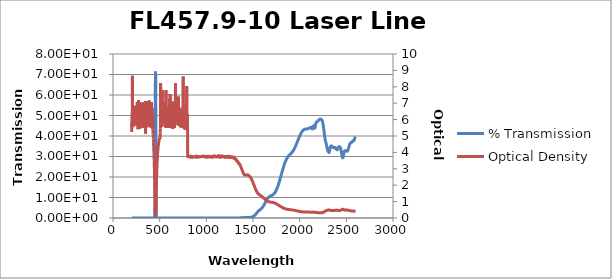
| Category | % Transmission |
|---|---|
| 200.0 | 0.001 |
| 201.0 | 0.001 |
| 202.0 | 0 |
| 203.0 | 0 |
| 204.0 | 0 |
| 205.0 | 0 |
| 206.0 | 0 |
| 207.0 | 0 |
| 208.0 | 0 |
| 209.0 | 0 |
| 210.0 | 0 |
| 211.0 | 0 |
| 212.0 | 0 |
| 213.0 | 0 |
| 214.0 | 0 |
| 215.0 | 0 |
| 216.0 | 0 |
| 217.0 | 0 |
| 218.0 | 0 |
| 219.0 | 0 |
| 220.0 | 0 |
| 221.0 | 0 |
| 222.0 | 0 |
| 223.0 | 0 |
| 224.0 | 0 |
| 225.0 | 0 |
| 226.0 | 0 |
| 227.0 | 0 |
| 228.0 | 0 |
| 229.0 | 0 |
| 230.0 | 0 |
| 231.0 | 0 |
| 232.0 | 0 |
| 233.0 | 0 |
| 234.0 | 0 |
| 235.0 | 0 |
| 236.0 | 0 |
| 237.0 | 0 |
| 238.0 | 0 |
| 239.0 | 0 |
| 240.0 | 0 |
| 241.0 | 0 |
| 242.0 | 0 |
| 243.0 | 0 |
| 244.0 | 0 |
| 245.0 | 0 |
| 246.0 | 0 |
| 247.0 | 0 |
| 248.0 | 0 |
| 249.0 | 0 |
| 250.0 | 0 |
| 251.0 | 0 |
| 252.0 | 0 |
| 253.0 | 0 |
| 254.0 | 0 |
| 255.0 | 0 |
| 256.0 | 0 |
| 257.0 | 0 |
| 258.0 | 0 |
| 259.0 | 0 |
| 260.0 | 0 |
| 261.0 | 0 |
| 262.0 | 0 |
| 263.0 | 0 |
| 264.0 | 0 |
| 265.0 | 0 |
| 266.0 | 0 |
| 267.0 | 0 |
| 268.0 | 0 |
| 269.0 | 0 |
| 270.0 | 0 |
| 271.0 | 0 |
| 272.0 | 0 |
| 273.0 | 0 |
| 274.0 | 0 |
| 275.0 | 0 |
| 276.0 | 0 |
| 277.0 | 0 |
| 278.0 | 0 |
| 279.0 | 0 |
| 280.0 | 0 |
| 281.0 | 0 |
| 282.0 | 0 |
| 283.0 | 0 |
| 284.0 | 0 |
| 285.0 | 0 |
| 286.0 | 0 |
| 287.0 | 0 |
| 288.0 | 0 |
| 289.0 | 0 |
| 290.0 | 0 |
| 291.0 | 0 |
| 292.0 | 0 |
| 293.0 | 0 |
| 294.0 | 0 |
| 295.0 | 0 |
| 296.0 | 0 |
| 297.0 | 0 |
| 298.0 | 0 |
| 299.0 | 0 |
| 300.0 | 0 |
| 301.0 | 0 |
| 302.0 | 0 |
| 303.0 | 0 |
| 304.0 | 0 |
| 305.0 | 0 |
| 306.0 | 0 |
| 307.0 | 0 |
| 308.0 | 0 |
| 309.0 | 0 |
| 310.0 | 0 |
| 311.0 | 0 |
| 312.0 | 0 |
| 313.0 | 0 |
| 314.0 | 0 |
| 315.0 | 0 |
| 316.0 | 0 |
| 317.0 | 0 |
| 318.0 | 0 |
| 319.0 | 0 |
| 320.0 | 0 |
| 321.0 | 0 |
| 322.0 | 0 |
| 323.0 | 0 |
| 324.0 | 0 |
| 325.0 | 0 |
| 326.0 | 0 |
| 327.0 | 0 |
| 328.0 | 0 |
| 329.0 | 0 |
| 330.0 | 0 |
| 331.0 | 0 |
| 332.0 | 0 |
| 333.0 | 0 |
| 334.0 | 0 |
| 335.0 | 0 |
| 336.0 | 0 |
| 337.0 | 0 |
| 338.0 | 0 |
| 339.0 | 0 |
| 340.0 | 0 |
| 341.0 | 0 |
| 342.0 | 0 |
| 343.0 | 0 |
| 344.0 | 0 |
| 345.0 | 0 |
| 346.0 | 0 |
| 347.0 | 0 |
| 348.0 | 0 |
| 349.0 | 0.001 |
| 350.0 | 0 |
| 351.0 | 0 |
| 352.0 | 0 |
| 353.0 | 0 |
| 354.0 | 0 |
| 355.0 | 0 |
| 356.0 | 0 |
| 357.0 | 0 |
| 358.0 | 0 |
| 359.0 | 0 |
| 360.0 | 0 |
| 361.0 | 0 |
| 362.0 | 0 |
| 363.0 | 0 |
| 364.0 | 0 |
| 365.0 | 0 |
| 366.0 | 0 |
| 367.0 | 0 |
| 368.0 | 0 |
| 369.0 | 0 |
| 370.0 | 0 |
| 371.0 | 0 |
| 372.0 | 0 |
| 373.0 | 0 |
| 374.0 | 0 |
| 375.0 | 0 |
| 376.0 | 0 |
| 377.0 | 0 |
| 378.0 | 0 |
| 379.0 | 0 |
| 380.0 | 0 |
| 381.0 | 0 |
| 382.0 | 0 |
| 383.0 | 0 |
| 384.0 | 0 |
| 385.0 | 0 |
| 386.0 | 0 |
| 387.0 | 0 |
| 388.0 | 0 |
| 389.0 | 0 |
| 390.0 | 0 |
| 391.0 | 0 |
| 392.0 | 0 |
| 393.0 | 0 |
| 394.0 | 0 |
| 395.0 | 0 |
| 396.0 | 0 |
| 397.0 | 0 |
| 398.0 | 0 |
| 399.0 | 0 |
| 400.0 | 0 |
| 401.0 | 0 |
| 402.0 | 0 |
| 403.0 | 0 |
| 404.0 | 0 |
| 405.0 | 0 |
| 406.0 | 0 |
| 407.0 | 0 |
| 408.0 | 0 |
| 409.0 | 0 |
| 410.0 | 0 |
| 411.0 | 0 |
| 412.0 | 0 |
| 413.0 | 0 |
| 414.0 | 0 |
| 415.0 | 0 |
| 416.0 | 0 |
| 417.0 | 0 |
| 418.0 | 0 |
| 419.0 | 0 |
| 420.0 | 0 |
| 421.0 | 0 |
| 422.0 | 0 |
| 423.0 | 0 |
| 424.0 | 0 |
| 425.0 | 0 |
| 426.0 | 0 |
| 427.0 | 0 |
| 428.0 | 0 |
| 429.0 | 0.001 |
| 430.0 | 0.001 |
| 431.0 | 0.001 |
| 432.0 | 0.001 |
| 433.0 | 0.002 |
| 434.0 | 0.002 |
| 435.0 | 0.003 |
| 436.0 | 0.004 |
| 437.0 | 0.006 |
| 438.0 | 0.009 |
| 439.0 | 0.013 |
| 440.0 | 0.019 |
| 441.0 | 0.03 |
| 442.0 | 0.048 |
| 443.0 | 0.08 |
| 444.0 | 0.139 |
| 445.0 | 0.257 |
| 446.0 | 0.506 |
| 447.0 | 1.075 |
| 448.0 | 2.472 |
| 449.0 | 5.96 |
| 450.0 | 13.668 |
| 451.0 | 26.602 |
| 452.0 | 42.537 |
| 453.0 | 56.255 |
| 454.0 | 65.276 |
| 455.0 | 69.96 |
| 456.0 | 71.432 |
| 457.0 | 70.375 |
| 458.0 | 65.673 |
| 459.0 | 54.675 |
| 460.0 | 37.794 |
| 461.0 | 21.076 |
| 462.0 | 9.936 |
| 463.0 | 4.436 |
| 464.0 | 2.092 |
| 465.0 | 1.06 |
| 466.0 | 0.587 |
| 467.0 | 0.349 |
| 468.0 | 0.219 |
| 469.0 | 0.144 |
| 470.0 | 0.098 |
| 471.0 | 0.069 |
| 472.0 | 0.05 |
| 473.0 | 0.037 |
| 474.0 | 0.028 |
| 475.0 | 0.022 |
| 476.0 | 0.017 |
| 477.0 | 0.014 |
| 478.0 | 0.011 |
| 479.0 | 0.01 |
| 480.0 | 0.008 |
| 481.0 | 0.007 |
| 482.0 | 0.006 |
| 483.0 | 0.005 |
| 484.0 | 0.004 |
| 485.0 | 0.004 |
| 486.0 | 0.004 |
| 487.0 | 0.003 |
| 488.0 | 0.003 |
| 489.0 | 0.003 |
| 490.0 | 0.002 |
| 491.0 | 0.002 |
| 492.0 | 0.002 |
| 493.0 | 0.002 |
| 494.0 | 0.002 |
| 495.0 | 0.002 |
| 496.0 | 0.001 |
| 497.0 | 0.001 |
| 498.0 | 0.001 |
| 499.0 | 0.001 |
| 500.0 | 0.001 |
| 501.0 | 0.001 |
| 502.0 | 0.001 |
| 503.0 | 0.001 |
| 504.0 | 0.001 |
| 505.0 | 0.001 |
| 506.0 | 0.001 |
| 507.0 | 0 |
| 508.0 | 0 |
| 509.0 | 0 |
| 510.0 | 0 |
| 511.0 | 0 |
| 512.0 | 0 |
| 513.0 | 0 |
| 514.0 | 0 |
| 515.0 | 0 |
| 516.0 | 0 |
| 517.0 | 0 |
| 518.0 | 0 |
| 519.0 | 0 |
| 520.0 | 0 |
| 521.0 | 0 |
| 522.0 | 0 |
| 523.0 | 0 |
| 524.0 | 0 |
| 525.0 | 0 |
| 526.0 | 0 |
| 527.0 | 0 |
| 528.0 | 0 |
| 529.0 | 0 |
| 530.0 | 0 |
| 531.0 | 0 |
| 532.0 | 0 |
| 533.0 | 0 |
| 534.0 | 0 |
| 535.0 | 0 |
| 536.0 | 0 |
| 537.0 | 0 |
| 538.0 | 0 |
| 539.0 | 0 |
| 540.0 | 0 |
| 541.0 | 0 |
| 542.0 | 0 |
| 543.0 | 0 |
| 544.0 | 0 |
| 545.0 | 0 |
| 546.0 | 0 |
| 547.0 | 0 |
| 548.0 | 0 |
| 549.0 | 0 |
| 550.0 | 0 |
| 551.0 | 0 |
| 552.0 | 0 |
| 553.0 | 0 |
| 554.0 | 0 |
| 555.0 | 0 |
| 556.0 | 0 |
| 557.0 | 0 |
| 558.0 | 0 |
| 559.0 | 0 |
| 560.0 | 0 |
| 561.0 | 0 |
| 562.0 | 0 |
| 563.0 | 0 |
| 564.0 | 0 |
| 565.0 | 0 |
| 566.0 | 0 |
| 567.0 | 0 |
| 568.0 | 0 |
| 569.0 | 0 |
| 570.0 | 0 |
| 571.0 | 0 |
| 572.0 | 0 |
| 573.0 | 0 |
| 574.0 | 0 |
| 575.0 | 0 |
| 576.0 | 0 |
| 577.0 | 0 |
| 578.0 | 0 |
| 579.0 | 0 |
| 580.0 | 0 |
| 581.0 | 0 |
| 582.0 | 0 |
| 583.0 | 0 |
| 584.0 | 0 |
| 585.0 | 0 |
| 586.0 | 0 |
| 587.0 | 0 |
| 588.0 | 0 |
| 589.0 | 0 |
| 590.0 | 0 |
| 591.0 | 0 |
| 592.0 | 0 |
| 593.0 | 0 |
| 594.0 | 0 |
| 595.0 | 0 |
| 596.0 | 0 |
| 597.0 | 0 |
| 598.0 | 0 |
| 599.0 | 0 |
| 600.0 | 0 |
| 601.0 | 0 |
| 602.0 | 0 |
| 603.0 | 0 |
| 604.0 | 0 |
| 605.0 | 0 |
| 606.0 | 0 |
| 607.0 | 0 |
| 608.0 | 0 |
| 609.0 | 0 |
| 610.0 | 0 |
| 611.0 | 0 |
| 612.0 | 0 |
| 613.0 | 0 |
| 614.0 | 0 |
| 615.0 | 0 |
| 616.0 | 0 |
| 617.0 | 0 |
| 618.0 | 0 |
| 619.0 | 0 |
| 620.0 | 0 |
| 621.0 | 0 |
| 622.0 | 0 |
| 623.0 | 0 |
| 624.0 | 0 |
| 625.0 | 0 |
| 626.0 | 0 |
| 627.0 | 0 |
| 628.0 | 0 |
| 629.0 | 0 |
| 630.0 | 0 |
| 631.0 | 0 |
| 632.0 | 0 |
| 633.0 | 0 |
| 634.0 | 0 |
| 635.0 | 0 |
| 636.0 | 0 |
| 637.0 | 0 |
| 638.0 | 0 |
| 639.0 | 0 |
| 640.0 | 0 |
| 641.0 | 0 |
| 642.0 | 0 |
| 643.0 | 0 |
| 644.0 | 0 |
| 645.0 | 0 |
| 646.0 | 0 |
| 647.0 | 0 |
| 648.0 | 0 |
| 649.0 | 0 |
| 650.0 | 0 |
| 651.0 | 0 |
| 652.0 | 0 |
| 653.0 | 0 |
| 654.0 | 0 |
| 655.0 | 0 |
| 656.0 | 0 |
| 657.0 | 0 |
| 658.0 | 0 |
| 659.0 | 0 |
| 660.0 | 0 |
| 661.0 | 0 |
| 662.0 | 0 |
| 663.0 | 0 |
| 664.0 | 0 |
| 665.0 | 0 |
| 666.0 | 0 |
| 667.0 | 0 |
| 668.0 | 0 |
| 669.0 | 0 |
| 670.0 | 0 |
| 671.0 | 0 |
| 672.0 | 0 |
| 673.0 | 0 |
| 674.0 | 0 |
| 675.0 | 0 |
| 676.0 | 0 |
| 677.0 | 0 |
| 678.0 | 0 |
| 679.0 | 0 |
| 680.0 | 0 |
| 681.0 | 0 |
| 682.0 | 0 |
| 683.0 | 0 |
| 684.0 | 0 |
| 685.0 | 0 |
| 686.0 | 0 |
| 687.0 | 0 |
| 688.0 | 0 |
| 689.0 | 0 |
| 690.0 | 0 |
| 691.0 | 0 |
| 692.0 | 0 |
| 693.0 | 0 |
| 694.0 | 0 |
| 695.0 | 0 |
| 696.0 | 0 |
| 697.0 | 0 |
| 698.0 | 0 |
| 699.0 | 0 |
| 700.0 | 0 |
| 701.0 | 0 |
| 702.0 | 0 |
| 703.0 | 0 |
| 704.0 | 0 |
| 705.0 | 0 |
| 706.0 | 0 |
| 707.0 | 0 |
| 708.0 | 0 |
| 709.0 | 0 |
| 710.0 | 0 |
| 711.0 | 0 |
| 712.0 | 0 |
| 713.0 | 0 |
| 714.0 | 0 |
| 715.0 | 0 |
| 716.0 | 0 |
| 717.0 | 0 |
| 718.0 | 0 |
| 719.0 | 0 |
| 720.0 | 0 |
| 721.0 | 0 |
| 722.0 | 0 |
| 723.0 | 0 |
| 724.0 | 0 |
| 725.0 | 0 |
| 726.0 | 0 |
| 727.0 | 0 |
| 728.0 | 0 |
| 729.0 | 0 |
| 730.0 | 0 |
| 731.0 | 0 |
| 732.0 | 0 |
| 733.0 | 0 |
| 734.0 | 0 |
| 735.0 | 0 |
| 736.0 | 0 |
| 737.0 | 0 |
| 738.0 | 0 |
| 739.0 | 0 |
| 740.0 | 0 |
| 741.0 | 0 |
| 742.0 | 0 |
| 743.0 | 0 |
| 744.0 | 0 |
| 745.0 | 0 |
| 746.0 | 0 |
| 747.0 | 0 |
| 748.0 | 0 |
| 749.0 | 0 |
| 750.0 | 0 |
| 751.0 | 0 |
| 752.0 | 0 |
| 753.0 | 0 |
| 754.0 | 0 |
| 755.0 | 0 |
| 756.0 | 0 |
| 757.0 | 0 |
| 758.0 | 0 |
| 759.0 | 0 |
| 760.0 | 0 |
| 761.0 | 0 |
| 762.0 | 0 |
| 763.0 | 0 |
| 764.0 | 0 |
| 765.0 | 0 |
| 766.0 | 0 |
| 767.0 | 0 |
| 768.0 | 0 |
| 769.0 | 0 |
| 770.0 | 0 |
| 771.0 | 0 |
| 772.0 | 0 |
| 773.0 | 0 |
| 774.0 | 0 |
| 775.0 | 0 |
| 776.0 | 0 |
| 777.0 | 0 |
| 778.0 | 0 |
| 779.0 | 0 |
| 780.0 | 0 |
| 781.0 | 0 |
| 782.0 | 0 |
| 783.0 | 0 |
| 784.0 | 0 |
| 785.0 | 0 |
| 786.0 | 0 |
| 787.0 | 0 |
| 788.0 | 0 |
| 789.0 | 0 |
| 790.0 | 0 |
| 791.0 | 0 |
| 792.0 | 0 |
| 793.0 | 0 |
| 794.0 | 0 |
| 795.0 | 0 |
| 796.0 | 0 |
| 797.0 | 0 |
| 798.0 | 0 |
| 799.0 | 0 |
| 800.0 | 0.017 |
| 801.0 | 0.019 |
| 802.0 | 0.017 |
| 803.0 | 0.016 |
| 804.0 | 0.02 |
| 805.0 | 0.016 |
| 806.0 | 0.018 |
| 807.0 | 0.018 |
| 808.0 | 0.018 |
| 809.0 | 0.017 |
| 810.0 | 0.02 |
| 811.0 | 0.019 |
| 812.0 | 0.018 |
| 813.0 | 0.017 |
| 814.0 | 0.017 |
| 815.0 | 0.017 |
| 816.0 | 0.017 |
| 817.0 | 0.02 |
| 818.0 | 0.018 |
| 819.0 | 0.017 |
| 820.0 | 0.016 |
| 821.0 | 0.018 |
| 822.0 | 0.019 |
| 823.0 | 0.018 |
| 824.0 | 0.019 |
| 825.0 | 0.019 |
| 826.0 | 0.019 |
| 827.0 | 0.018 |
| 828.0 | 0.019 |
| 829.0 | 0.017 |
| 830.0 | 0.017 |
| 831.0 | 0.017 |
| 832.0 | 0.017 |
| 833.0 | 0.017 |
| 834.0 | 0.017 |
| 835.0 | 0.017 |
| 836.0 | 0.018 |
| 837.0 | 0.018 |
| 838.0 | 0.018 |
| 839.0 | 0.018 |
| 840.0 | 0.023 |
| 841.0 | 0.017 |
| 842.0 | 0.021 |
| 843.0 | 0.018 |
| 844.0 | 0.018 |
| 845.0 | 0.019 |
| 846.0 | 0.017 |
| 847.0 | 0.016 |
| 848.0 | 0.021 |
| 849.0 | 0.018 |
| 850.0 | 0.019 |
| 851.0 | 0.019 |
| 852.0 | 0.02 |
| 853.0 | 0.019 |
| 854.0 | 0.018 |
| 855.0 | 0.018 |
| 856.0 | 0.019 |
| 857.0 | 0.019 |
| 858.0 | 0.021 |
| 859.0 | 0.021 |
| 860.0 | 0.018 |
| 861.0 | 0.018 |
| 862.0 | 0.016 |
| 863.0 | 0.018 |
| 864.0 | 0.019 |
| 865.0 | 0.019 |
| 866.0 | 0.019 |
| 867.0 | 0.019 |
| 868.0 | 0.019 |
| 869.0 | 0.019 |
| 870.0 | 0.016 |
| 871.0 | 0.02 |
| 872.0 | 0.017 |
| 873.0 | 0.02 |
| 874.0 | 0.02 |
| 875.0 | 0.017 |
| 876.0 | 0.018 |
| 877.0 | 0.017 |
| 878.0 | 0.019 |
| 879.0 | 0.018 |
| 880.0 | 0.019 |
| 881.0 | 0.019 |
| 882.0 | 0.018 |
| 883.0 | 0.019 |
| 884.0 | 0.017 |
| 885.0 | 0.017 |
| 886.0 | 0.018 |
| 887.0 | 0.019 |
| 888.0 | 0.019 |
| 889.0 | 0.016 |
| 890.0 | 0.017 |
| 891.0 | 0.018 |
| 892.0 | 0.016 |
| 893.0 | 0.017 |
| 894.0 | 0.02 |
| 895.0 | 0.017 |
| 896.0 | 0.017 |
| 897.0 | 0.017 |
| 898.0 | 0.017 |
| 899.0 | 0.018 |
| 900.0 | 0.019 |
| 901.0 | 0.018 |
| 902.0 | 0.018 |
| 903.0 | 0.019 |
| 904.0 | 0.02 |
| 905.0 | 0.02 |
| 906.0 | 0.02 |
| 907.0 | 0.019 |
| 908.0 | 0.016 |
| 909.0 | 0.015 |
| 910.0 | 0.018 |
| 911.0 | 0.016 |
| 912.0 | 0.021 |
| 913.0 | 0.02 |
| 914.0 | 0.017 |
| 915.0 | 0.017 |
| 916.0 | 0.018 |
| 917.0 | 0.018 |
| 918.0 | 0.018 |
| 919.0 | 0.016 |
| 920.0 | 0.017 |
| 921.0 | 0.02 |
| 922.0 | 0.021 |
| 923.0 | 0.018 |
| 924.0 | 0.02 |
| 925.0 | 0.019 |
| 926.0 | 0.019 |
| 927.0 | 0.019 |
| 928.0 | 0.02 |
| 929.0 | 0.017 |
| 930.0 | 0.018 |
| 931.0 | 0.017 |
| 932.0 | 0.019 |
| 933.0 | 0.017 |
| 934.0 | 0.021 |
| 935.0 | 0.018 |
| 936.0 | 0.019 |
| 937.0 | 0.017 |
| 938.0 | 0.019 |
| 939.0 | 0.018 |
| 940.0 | 0.019 |
| 941.0 | 0.02 |
| 942.0 | 0.016 |
| 943.0 | 0.017 |
| 944.0 | 0.018 |
| 945.0 | 0.018 |
| 946.0 | 0.02 |
| 947.0 | 0.019 |
| 948.0 | 0.018 |
| 949.0 | 0.019 |
| 950.0 | 0.017 |
| 951.0 | 0.018 |
| 952.0 | 0.019 |
| 953.0 | 0.021 |
| 954.0 | 0.019 |
| 955.0 | 0.019 |
| 956.0 | 0.018 |
| 957.0 | 0.017 |
| 958.0 | 0.018 |
| 959.0 | 0.016 |
| 960.0 | 0.017 |
| 961.0 | 0.017 |
| 962.0 | 0.017 |
| 963.0 | 0.019 |
| 964.0 | 0.02 |
| 965.0 | 0.016 |
| 966.0 | 0.017 |
| 967.0 | 0.018 |
| 968.0 | 0.017 |
| 969.0 | 0.018 |
| 970.0 | 0.018 |
| 971.0 | 0.019 |
| 972.0 | 0.017 |
| 973.0 | 0.021 |
| 974.0 | 0.018 |
| 975.0 | 0.017 |
| 976.0 | 0.018 |
| 977.0 | 0.017 |
| 978.0 | 0.02 |
| 979.0 | 0.017 |
| 980.0 | 0.019 |
| 981.0 | 0.019 |
| 982.0 | 0.018 |
| 983.0 | 0.018 |
| 984.0 | 0.018 |
| 985.0 | 0.018 |
| 986.0 | 0.019 |
| 987.0 | 0.019 |
| 988.0 | 0.016 |
| 989.0 | 0.02 |
| 990.0 | 0.018 |
| 991.0 | 0.019 |
| 992.0 | 0.016 |
| 993.0 | 0.017 |
| 994.0 | 0.018 |
| 995.0 | 0.018 |
| 996.0 | 0.02 |
| 997.0 | 0.019 |
| 998.0 | 0.017 |
| 999.0 | 0.018 |
| 1000.0 | 0.017 |
| 1001.0 | 0.017 |
| 1002.0 | 0.018 |
| 1003.0 | 0.018 |
| 1004.0 | 0.019 |
| 1005.0 | 0.021 |
| 1006.0 | 0.017 |
| 1007.0 | 0.016 |
| 1008.0 | 0.021 |
| 1009.0 | 0.018 |
| 1010.0 | 0.016 |
| 1011.0 | 0.015 |
| 1012.0 | 0.019 |
| 1013.0 | 0.017 |
| 1014.0 | 0.019 |
| 1015.0 | 0.02 |
| 1016.0 | 0.019 |
| 1017.0 | 0.018 |
| 1018.0 | 0.018 |
| 1019.0 | 0.017 |
| 1020.0 | 0.016 |
| 1021.0 | 0.019 |
| 1022.0 | 0.016 |
| 1023.0 | 0.014 |
| 1024.0 | 0.018 |
| 1025.0 | 0.019 |
| 1026.0 | 0.018 |
| 1027.0 | 0.017 |
| 1028.0 | 0.018 |
| 1029.0 | 0.017 |
| 1030.0 | 0.017 |
| 1031.0 | 0.018 |
| 1032.0 | 0.017 |
| 1033.0 | 0.016 |
| 1034.0 | 0.018 |
| 1035.0 | 0.018 |
| 1036.0 | 0.016 |
| 1037.0 | 0.02 |
| 1038.0 | 0.016 |
| 1039.0 | 0.016 |
| 1040.0 | 0.019 |
| 1041.0 | 0.018 |
| 1042.0 | 0.017 |
| 1043.0 | 0.018 |
| 1044.0 | 0.018 |
| 1045.0 | 0.019 |
| 1046.0 | 0.02 |
| 1047.0 | 0.02 |
| 1048.0 | 0.017 |
| 1049.0 | 0.018 |
| 1050.0 | 0.018 |
| 1051.0 | 0.02 |
| 1052.0 | 0.02 |
| 1053.0 | 0.018 |
| 1054.0 | 0.02 |
| 1055.0 | 0.017 |
| 1056.0 | 0.02 |
| 1057.0 | 0.018 |
| 1058.0 | 0.017 |
| 1059.0 | 0.019 |
| 1060.0 | 0.017 |
| 1061.0 | 0.019 |
| 1062.0 | 0.02 |
| 1063.0 | 0.02 |
| 1064.0 | 0.016 |
| 1065.0 | 0.02 |
| 1066.0 | 0.019 |
| 1067.0 | 0.018 |
| 1068.0 | 0.016 |
| 1069.0 | 0.021 |
| 1070.0 | 0.02 |
| 1071.0 | 0.018 |
| 1072.0 | 0.017 |
| 1073.0 | 0.017 |
| 1074.0 | 0.018 |
| 1075.0 | 0.017 |
| 1076.0 | 0.018 |
| 1077.0 | 0.018 |
| 1078.0 | 0.018 |
| 1079.0 | 0.019 |
| 1080.0 | 0.019 |
| 1081.0 | 0.018 |
| 1082.0 | 0.017 |
| 1083.0 | 0.019 |
| 1084.0 | 0.018 |
| 1085.0 | 0.018 |
| 1086.0 | 0.019 |
| 1087.0 | 0.017 |
| 1088.0 | 0.016 |
| 1089.0 | 0.018 |
| 1090.0 | 0.017 |
| 1091.0 | 0.021 |
| 1092.0 | 0.017 |
| 1093.0 | 0.017 |
| 1094.0 | 0.019 |
| 1095.0 | 0.017 |
| 1096.0 | 0.018 |
| 1097.0 | 0.017 |
| 1098.0 | 0.018 |
| 1099.0 | 0.018 |
| 1100.0 | 0.019 |
| 1101.0 | 0.017 |
| 1102.0 | 0.018 |
| 1103.0 | 0.016 |
| 1104.0 | 0.017 |
| 1105.0 | 0.017 |
| 1106.0 | 0.018 |
| 1107.0 | 0.018 |
| 1108.0 | 0.016 |
| 1109.0 | 0.019 |
| 1110.0 | 0.019 |
| 1111.0 | 0.02 |
| 1112.0 | 0.019 |
| 1113.0 | 0.017 |
| 1114.0 | 0.018 |
| 1115.0 | 0.019 |
| 1116.0 | 0.02 |
| 1117.0 | 0.02 |
| 1118.0 | 0.017 |
| 1119.0 | 0.019 |
| 1120.0 | 0.017 |
| 1121.0 | 0.019 |
| 1122.0 | 0.015 |
| 1123.0 | 0.02 |
| 1124.0 | 0.019 |
| 1125.0 | 0.019 |
| 1126.0 | 0.017 |
| 1127.0 | 0.017 |
| 1128.0 | 0.016 |
| 1129.0 | 0.017 |
| 1130.0 | 0.015 |
| 1131.0 | 0.018 |
| 1132.0 | 0.019 |
| 1133.0 | 0.018 |
| 1134.0 | 0.019 |
| 1135.0 | 0.018 |
| 1136.0 | 0.016 |
| 1137.0 | 0.016 |
| 1138.0 | 0.016 |
| 1139.0 | 0.018 |
| 1140.0 | 0.019 |
| 1141.0 | 0.019 |
| 1142.0 | 0.017 |
| 1143.0 | 0.018 |
| 1144.0 | 0.02 |
| 1145.0 | 0.016 |
| 1146.0 | 0.019 |
| 1147.0 | 0.016 |
| 1148.0 | 0.018 |
| 1149.0 | 0.02 |
| 1150.0 | 0.019 |
| 1151.0 | 0.019 |
| 1152.0 | 0.018 |
| 1153.0 | 0.019 |
| 1154.0 | 0.017 |
| 1155.0 | 0.019 |
| 1156.0 | 0.017 |
| 1157.0 | 0.018 |
| 1158.0 | 0.017 |
| 1159.0 | 0.019 |
| 1160.0 | 0.016 |
| 1161.0 | 0.017 |
| 1162.0 | 0.018 |
| 1163.0 | 0.017 |
| 1164.0 | 0.017 |
| 1165.0 | 0.018 |
| 1166.0 | 0.019 |
| 1167.0 | 0.016 |
| 1168.0 | 0.015 |
| 1169.0 | 0.02 |
| 1170.0 | 0.018 |
| 1171.0 | 0.017 |
| 1172.0 | 0.017 |
| 1173.0 | 0.019 |
| 1174.0 | 0.018 |
| 1175.0 | 0.017 |
| 1176.0 | 0.018 |
| 1177.0 | 0.018 |
| 1178.0 | 0.019 |
| 1179.0 | 0.022 |
| 1180.0 | 0.016 |
| 1181.0 | 0.019 |
| 1182.0 | 0.017 |
| 1183.0 | 0.017 |
| 1184.0 | 0.016 |
| 1185.0 | 0.019 |
| 1186.0 | 0.018 |
| 1187.0 | 0.02 |
| 1188.0 | 0.019 |
| 1189.0 | 0.018 |
| 1190.0 | 0.02 |
| 1191.0 | 0.019 |
| 1192.0 | 0.019 |
| 1193.0 | 0.019 |
| 1194.0 | 0.018 |
| 1195.0 | 0.018 |
| 1196.0 | 0.018 |
| 1197.0 | 0.02 |
| 1198.0 | 0.021 |
| 1199.0 | 0.023 |
| 1200.0 | 0.017 |
| 1201.0 | 0.02 |
| 1202.0 | 0.019 |
| 1203.0 | 0.016 |
| 1204.0 | 0.02 |
| 1205.0 | 0.017 |
| 1206.0 | 0.018 |
| 1207.0 | 0.019 |
| 1208.0 | 0.019 |
| 1209.0 | 0.019 |
| 1210.0 | 0.018 |
| 1211.0 | 0.017 |
| 1212.0 | 0.018 |
| 1213.0 | 0.016 |
| 1214.0 | 0.018 |
| 1215.0 | 0.019 |
| 1216.0 | 0.016 |
| 1217.0 | 0.021 |
| 1218.0 | 0.019 |
| 1219.0 | 0.019 |
| 1220.0 | 0.019 |
| 1221.0 | 0.018 |
| 1222.0 | 0.019 |
| 1223.0 | 0.019 |
| 1224.0 | 0.019 |
| 1225.0 | 0.019 |
| 1226.0 | 0.02 |
| 1227.0 | 0.019 |
| 1228.0 | 0.018 |
| 1229.0 | 0.018 |
| 1230.0 | 0.02 |
| 1231.0 | 0.019 |
| 1232.0 | 0.018 |
| 1233.0 | 0.018 |
| 1234.0 | 0.017 |
| 1235.0 | 0.019 |
| 1236.0 | 0.019 |
| 1237.0 | 0.016 |
| 1238.0 | 0.017 |
| 1239.0 | 0.018 |
| 1240.0 | 0.018 |
| 1241.0 | 0.019 |
| 1242.0 | 0.018 |
| 1243.0 | 0.02 |
| 1244.0 | 0.02 |
| 1245.0 | 0.019 |
| 1246.0 | 0.017 |
| 1247.0 | 0.018 |
| 1248.0 | 0.018 |
| 1249.0 | 0.017 |
| 1250.0 | 0.018 |
| 1251.0 | 0.018 |
| 1252.0 | 0.019 |
| 1253.0 | 0.021 |
| 1254.0 | 0.018 |
| 1255.0 | 0.019 |
| 1256.0 | 0.018 |
| 1257.0 | 0.019 |
| 1258.0 | 0.019 |
| 1259.0 | 0.02 |
| 1260.0 | 0.02 |
| 1261.0 | 0.017 |
| 1262.0 | 0.02 |
| 1263.0 | 0.019 |
| 1264.0 | 0.019 |
| 1265.0 | 0.019 |
| 1266.0 | 0.019 |
| 1267.0 | 0.02 |
| 1268.0 | 0.018 |
| 1269.0 | 0.019 |
| 1270.0 | 0.018 |
| 1271.0 | 0.019 |
| 1272.0 | 0.019 |
| 1273.0 | 0.02 |
| 1274.0 | 0.021 |
| 1275.0 | 0.019 |
| 1276.0 | 0.019 |
| 1277.0 | 0.019 |
| 1278.0 | 0.018 |
| 1279.0 | 0.02 |
| 1280.0 | 0.021 |
| 1281.0 | 0.02 |
| 1282.0 | 0.021 |
| 1283.0 | 0.019 |
| 1284.0 | 0.019 |
| 1285.0 | 0.019 |
| 1286.0 | 0.021 |
| 1287.0 | 0.02 |
| 1288.0 | 0.022 |
| 1289.0 | 0.02 |
| 1290.0 | 0.02 |
| 1291.0 | 0.023 |
| 1292.0 | 0.019 |
| 1293.0 | 0.021 |
| 1294.0 | 0.021 |
| 1295.0 | 0.018 |
| 1296.0 | 0.018 |
| 1297.0 | 0.022 |
| 1298.0 | 0.021 |
| 1299.0 | 0.021 |
| 1300.0 | 0.023 |
| 1301.0 | 0.022 |
| 1302.0 | 0.023 |
| 1303.0 | 0.024 |
| 1304.0 | 0.024 |
| 1305.0 | 0.023 |
| 1306.0 | 0.023 |
| 1307.0 | 0.023 |
| 1308.0 | 0.024 |
| 1309.0 | 0.024 |
| 1310.0 | 0.023 |
| 1311.0 | 0.027 |
| 1312.0 | 0.024 |
| 1313.0 | 0.026 |
| 1314.0 | 0.025 |
| 1315.0 | 0.026 |
| 1316.0 | 0.029 |
| 1317.0 | 0.026 |
| 1318.0 | 0.027 |
| 1319.0 | 0.029 |
| 1320.0 | 0.028 |
| 1321.0 | 0.027 |
| 1322.0 | 0.029 |
| 1323.0 | 0.03 |
| 1324.0 | 0.031 |
| 1325.0 | 0.033 |
| 1326.0 | 0.033 |
| 1327.0 | 0.03 |
| 1328.0 | 0.035 |
| 1329.0 | 0.034 |
| 1330.0 | 0.032 |
| 1331.0 | 0.037 |
| 1332.0 | 0.037 |
| 1333.0 | 0.035 |
| 1334.0 | 0.036 |
| 1335.0 | 0.037 |
| 1336.0 | 0.037 |
| 1337.0 | 0.037 |
| 1338.0 | 0.039 |
| 1339.0 | 0.039 |
| 1340.0 | 0.041 |
| 1341.0 | 0.041 |
| 1342.0 | 0.042 |
| 1343.0 | 0.041 |
| 1344.0 | 0.046 |
| 1345.0 | 0.044 |
| 1346.0 | 0.045 |
| 1347.0 | 0.045 |
| 1348.0 | 0.046 |
| 1349.0 | 0.046 |
| 1350.0 | 0.048 |
| 1351.0 | 0.049 |
| 1352.0 | 0.048 |
| 1353.0 | 0.051 |
| 1354.0 | 0.052 |
| 1355.0 | 0.051 |
| 1356.0 | 0.054 |
| 1357.0 | 0.051 |
| 1358.0 | 0.055 |
| 1359.0 | 0.058 |
| 1360.0 | 0.057 |
| 1361.0 | 0.057 |
| 1362.0 | 0.065 |
| 1363.0 | 0.06 |
| 1364.0 | 0.064 |
| 1365.0 | 0.066 |
| 1366.0 | 0.068 |
| 1367.0 | 0.067 |
| 1368.0 | 0.071 |
| 1369.0 | 0.073 |
| 1370.0 | 0.077 |
| 1371.0 | 0.077 |
| 1372.0 | 0.079 |
| 1373.0 | 0.085 |
| 1374.0 | 0.088 |
| 1375.0 | 0.09 |
| 1376.0 | 0.091 |
| 1377.0 | 0.095 |
| 1378.0 | 0.099 |
| 1379.0 | 0.1 |
| 1380.0 | 0.105 |
| 1381.0 | 0.107 |
| 1382.0 | 0.111 |
| 1383.0 | 0.122 |
| 1384.0 | 0.12 |
| 1385.0 | 0.128 |
| 1386.0 | 0.13 |
| 1387.0 | 0.133 |
| 1388.0 | 0.142 |
| 1389.0 | 0.142 |
| 1390.0 | 0.149 |
| 1391.0 | 0.152 |
| 1392.0 | 0.162 |
| 1393.0 | 0.167 |
| 1394.0 | 0.168 |
| 1395.0 | 0.179 |
| 1396.0 | 0.184 |
| 1397.0 | 0.189 |
| 1398.0 | 0.189 |
| 1399.0 | 0.194 |
| 1400.0 | 0.202 |
| 1401.0 | 0.21 |
| 1402.0 | 0.211 |
| 1403.0 | 0.213 |
| 1404.0 | 0.22 |
| 1405.0 | 0.223 |
| 1406.0 | 0.226 |
| 1407.0 | 0.23 |
| 1408.0 | 0.233 |
| 1409.0 | 0.236 |
| 1410.0 | 0.235 |
| 1411.0 | 0.238 |
| 1412.0 | 0.24 |
| 1413.0 | 0.241 |
| 1414.0 | 0.242 |
| 1415.0 | 0.243 |
| 1416.0 | 0.241 |
| 1417.0 | 0.242 |
| 1418.0 | 0.241 |
| 1419.0 | 0.241 |
| 1420.0 | 0.242 |
| 1421.0 | 0.241 |
| 1422.0 | 0.239 |
| 1423.0 | 0.24 |
| 1424.0 | 0.24 |
| 1425.0 | 0.239 |
| 1426.0 | 0.239 |
| 1427.0 | 0.236 |
| 1428.0 | 0.237 |
| 1429.0 | 0.236 |
| 1430.0 | 0.234 |
| 1431.0 | 0.237 |
| 1432.0 | 0.238 |
| 1433.0 | 0.237 |
| 1434.0 | 0.235 |
| 1435.0 | 0.233 |
| 1436.0 | 0.235 |
| 1437.0 | 0.235 |
| 1438.0 | 0.235 |
| 1439.0 | 0.235 |
| 1440.0 | 0.237 |
| 1441.0 | 0.237 |
| 1442.0 | 0.236 |
| 1443.0 | 0.238 |
| 1444.0 | 0.236 |
| 1445.0 | 0.239 |
| 1446.0 | 0.241 |
| 1447.0 | 0.242 |
| 1448.0 | 0.242 |
| 1449.0 | 0.244 |
| 1450.0 | 0.247 |
| 1451.0 | 0.246 |
| 1452.0 | 0.252 |
| 1453.0 | 0.254 |
| 1454.0 | 0.253 |
| 1455.0 | 0.258 |
| 1456.0 | 0.258 |
| 1457.0 | 0.262 |
| 1458.0 | 0.265 |
| 1459.0 | 0.27 |
| 1460.0 | 0.272 |
| 1461.0 | 0.275 |
| 1462.0 | 0.279 |
| 1463.0 | 0.283 |
| 1464.0 | 0.287 |
| 1465.0 | 0.293 |
| 1466.0 | 0.296 |
| 1467.0 | 0.301 |
| 1468.0 | 0.304 |
| 1469.0 | 0.311 |
| 1470.0 | 0.319 |
| 1471.0 | 0.325 |
| 1472.0 | 0.326 |
| 1473.0 | 0.334 |
| 1474.0 | 0.344 |
| 1475.0 | 0.351 |
| 1476.0 | 0.357 |
| 1477.0 | 0.364 |
| 1478.0 | 0.373 |
| 1479.0 | 0.383 |
| 1480.0 | 0.391 |
| 1481.0 | 0.4 |
| 1482.0 | 0.41 |
| 1483.0 | 0.421 |
| 1484.0 | 0.429 |
| 1485.0 | 0.442 |
| 1486.0 | 0.454 |
| 1487.0 | 0.466 |
| 1488.0 | 0.483 |
| 1489.0 | 0.494 |
| 1490.0 | 0.51 |
| 1491.0 | 0.522 |
| 1492.0 | 0.537 |
| 1493.0 | 0.555 |
| 1494.0 | 0.572 |
| 1495.0 | 0.589 |
| 1496.0 | 0.606 |
| 1497.0 | 0.627 |
| 1498.0 | 0.644 |
| 1499.0 | 0.665 |
| 1500.0 | 0.686 |
| 1501.0 | 0.71 |
| 1502.0 | 0.733 |
| 1503.0 | 0.758 |
| 1504.0 | 0.783 |
| 1505.0 | 0.81 |
| 1506.0 | 0.835 |
| 1507.0 | 0.866 |
| 1508.0 | 0.893 |
| 1509.0 | 0.927 |
| 1510.0 | 0.96 |
| 1511.0 | 0.992 |
| 1512.0 | 1.025 |
| 1513.0 | 1.06 |
| 1514.0 | 1.1 |
| 1515.0 | 1.138 |
| 1516.0 | 1.176 |
| 1517.0 | 1.218 |
| 1518.0 | 1.261 |
| 1519.0 | 1.304 |
| 1520.0 | 1.35 |
| 1521.0 | 1.398 |
| 1522.0 | 1.446 |
| 1523.0 | 1.493 |
| 1524.0 | 1.541 |
| 1525.0 | 1.593 |
| 1526.0 | 1.644 |
| 1527.0 | 1.697 |
| 1528.0 | 1.754 |
| 1529.0 | 1.807 |
| 1530.0 | 1.864 |
| 1531.0 | 1.916 |
| 1532.0 | 1.976 |
| 1533.0 | 2.036 |
| 1534.0 | 2.092 |
| 1535.0 | 2.15 |
| 1536.0 | 2.208 |
| 1537.0 | 2.263 |
| 1538.0 | 2.324 |
| 1539.0 | 2.386 |
| 1540.0 | 2.449 |
| 1541.0 | 2.503 |
| 1542.0 | 2.565 |
| 1543.0 | 2.62 |
| 1544.0 | 2.677 |
| 1545.0 | 2.734 |
| 1546.0 | 2.794 |
| 1547.0 | 2.847 |
| 1548.0 | 2.901 |
| 1549.0 | 2.956 |
| 1550.0 | 3.007 |
| 1551.0 | 3.058 |
| 1552.0 | 3.113 |
| 1553.0 | 3.159 |
| 1554.0 | 3.208 |
| 1555.0 | 3.256 |
| 1556.0 | 3.301 |
| 1557.0 | 3.348 |
| 1558.0 | 3.389 |
| 1559.0 | 3.432 |
| 1560.0 | 3.475 |
| 1561.0 | 3.513 |
| 1562.0 | 3.551 |
| 1563.0 | 3.59 |
| 1564.0 | 3.631 |
| 1565.0 | 3.667 |
| 1566.0 | 3.706 |
| 1567.0 | 3.741 |
| 1568.0 | 3.775 |
| 1569.0 | 3.812 |
| 1570.0 | 3.848 |
| 1571.0 | 3.887 |
| 1572.0 | 3.92 |
| 1573.0 | 3.955 |
| 1574.0 | 3.989 |
| 1575.0 | 4.022 |
| 1576.0 | 4.057 |
| 1577.0 | 4.094 |
| 1578.0 | 4.132 |
| 1579.0 | 4.168 |
| 1580.0 | 4.202 |
| 1581.0 | 4.24 |
| 1582.0 | 4.279 |
| 1583.0 | 4.313 |
| 1584.0 | 4.355 |
| 1585.0 | 4.396 |
| 1586.0 | 4.436 |
| 1587.0 | 4.475 |
| 1588.0 | 4.519 |
| 1589.0 | 4.561 |
| 1590.0 | 4.609 |
| 1591.0 | 4.654 |
| 1592.0 | 4.7 |
| 1593.0 | 4.745 |
| 1594.0 | 4.797 |
| 1595.0 | 4.846 |
| 1596.0 | 4.896 |
| 1597.0 | 4.952 |
| 1598.0 | 5.002 |
| 1599.0 | 5.059 |
| 1600.0 | 5.115 |
| 1601.0 | 5.172 |
| 1602.0 | 5.234 |
| 1603.0 | 5.295 |
| 1604.0 | 5.351 |
| 1605.0 | 5.419 |
| 1606.0 | 5.482 |
| 1607.0 | 5.546 |
| 1608.0 | 5.616 |
| 1609.0 | 5.683 |
| 1610.0 | 5.754 |
| 1611.0 | 5.826 |
| 1612.0 | 5.898 |
| 1613.0 | 5.976 |
| 1614.0 | 6.043 |
| 1615.0 | 6.12 |
| 1616.0 | 6.203 |
| 1617.0 | 6.283 |
| 1618.0 | 6.361 |
| 1619.0 | 6.442 |
| 1620.0 | 6.525 |
| 1621.0 | 6.608 |
| 1622.0 | 6.702 |
| 1623.0 | 6.786 |
| 1624.0 | 6.872 |
| 1625.0 | 6.963 |
| 1626.0 | 7.051 |
| 1627.0 | 7.14 |
| 1628.0 | 7.231 |
| 1629.0 | 7.324 |
| 1630.0 | 7.408 |
| 1631.0 | 7.504 |
| 1632.0 | 7.595 |
| 1633.0 | 7.685 |
| 1634.0 | 7.775 |
| 1635.0 | 7.874 |
| 1636.0 | 7.967 |
| 1637.0 | 8.06 |
| 1638.0 | 8.152 |
| 1639.0 | 8.239 |
| 1640.0 | 8.332 |
| 1641.0 | 8.422 |
| 1642.0 | 8.512 |
| 1643.0 | 8.595 |
| 1644.0 | 8.675 |
| 1645.0 | 8.758 |
| 1646.0 | 8.841 |
| 1647.0 | 8.924 |
| 1648.0 | 9.008 |
| 1649.0 | 9.087 |
| 1650.0 | 9.171 |
| 1651.0 | 9.253 |
| 1652.0 | 9.327 |
| 1653.0 | 9.401 |
| 1654.0 | 9.475 |
| 1655.0 | 9.547 |
| 1656.0 | 9.609 |
| 1657.0 | 9.668 |
| 1658.0 | 9.723 |
| 1659.0 | 9.772 |
| 1660.0 | 9.819 |
| 1661.0 | 9.859 |
| 1662.0 | 9.891 |
| 1663.0 | 9.922 |
| 1664.0 | 9.946 |
| 1665.0 | 9.963 |
| 1666.0 | 9.986 |
| 1667.0 | 10.011 |
| 1668.0 | 10.039 |
| 1669.0 | 10.071 |
| 1670.0 | 10.116 |
| 1671.0 | 10.163 |
| 1672.0 | 10.217 |
| 1673.0 | 10.272 |
| 1674.0 | 10.33 |
| 1675.0 | 10.393 |
| 1676.0 | 10.448 |
| 1677.0 | 10.503 |
| 1678.0 | 10.551 |
| 1679.0 | 10.599 |
| 1680.0 | 10.633 |
| 1681.0 | 10.657 |
| 1682.0 | 10.675 |
| 1683.0 | 10.689 |
| 1684.0 | 10.693 |
| 1685.0 | 10.697 |
| 1686.0 | 10.698 |
| 1687.0 | 10.708 |
| 1688.0 | 10.72 |
| 1689.0 | 10.733 |
| 1690.0 | 10.755 |
| 1691.0 | 10.784 |
| 1692.0 | 10.809 |
| 1693.0 | 10.832 |
| 1694.0 | 10.852 |
| 1695.0 | 10.871 |
| 1696.0 | 10.872 |
| 1697.0 | 10.882 |
| 1698.0 | 10.891 |
| 1699.0 | 10.902 |
| 1700.0 | 10.919 |
| 1701.0 | 10.944 |
| 1702.0 | 10.976 |
| 1703.0 | 11.004 |
| 1704.0 | 11.043 |
| 1705.0 | 11.074 |
| 1706.0 | 11.114 |
| 1707.0 | 11.147 |
| 1708.0 | 11.182 |
| 1709.0 | 11.219 |
| 1710.0 | 11.258 |
| 1711.0 | 11.292 |
| 1712.0 | 11.323 |
| 1713.0 | 11.359 |
| 1714.0 | 11.392 |
| 1715.0 | 11.416 |
| 1716.0 | 11.447 |
| 1717.0 | 11.48 |
| 1718.0 | 11.507 |
| 1719.0 | 11.539 |
| 1720.0 | 11.578 |
| 1721.0 | 11.612 |
| 1722.0 | 11.654 |
| 1723.0 | 11.702 |
| 1724.0 | 11.752 |
| 1725.0 | 11.802 |
| 1726.0 | 11.855 |
| 1727.0 | 11.912 |
| 1728.0 | 11.962 |
| 1729.0 | 12.016 |
| 1730.0 | 12.075 |
| 1731.0 | 12.132 |
| 1732.0 | 12.188 |
| 1733.0 | 12.248 |
| 1734.0 | 12.312 |
| 1735.0 | 12.373 |
| 1736.0 | 12.44 |
| 1737.0 | 12.517 |
| 1738.0 | 12.591 |
| 1739.0 | 12.668 |
| 1740.0 | 12.752 |
| 1741.0 | 12.838 |
| 1742.0 | 12.922 |
| 1743.0 | 13.018 |
| 1744.0 | 13.122 |
| 1745.0 | 13.212 |
| 1746.0 | 13.312 |
| 1747.0 | 13.412 |
| 1748.0 | 13.506 |
| 1749.0 | 13.607 |
| 1750.0 | 13.714 |
| 1751.0 | 13.819 |
| 1752.0 | 13.92 |
| 1753.0 | 14.033 |
| 1754.0 | 14.134 |
| 1755.0 | 14.236 |
| 1756.0 | 14.35 |
| 1757.0 | 14.462 |
| 1758.0 | 14.566 |
| 1759.0 | 14.676 |
| 1760.0 | 14.785 |
| 1761.0 | 14.895 |
| 1762.0 | 15.009 |
| 1763.0 | 15.126 |
| 1764.0 | 15.243 |
| 1765.0 | 15.361 |
| 1766.0 | 15.478 |
| 1767.0 | 15.599 |
| 1768.0 | 15.723 |
| 1769.0 | 15.858 |
| 1770.0 | 15.988 |
| 1771.0 | 16.124 |
| 1772.0 | 16.262 |
| 1773.0 | 16.399 |
| 1774.0 | 16.546 |
| 1775.0 | 16.689 |
| 1776.0 | 16.837 |
| 1777.0 | 16.987 |
| 1778.0 | 17.135 |
| 1779.0 | 17.284 |
| 1780.0 | 17.436 |
| 1781.0 | 17.59 |
| 1782.0 | 17.745 |
| 1783.0 | 17.905 |
| 1784.0 | 18.06 |
| 1785.0 | 18.211 |
| 1786.0 | 18.371 |
| 1787.0 | 18.518 |
| 1788.0 | 18.682 |
| 1789.0 | 18.845 |
| 1790.0 | 18.995 |
| 1791.0 | 19.153 |
| 1792.0 | 19.311 |
| 1793.0 | 19.466 |
| 1794.0 | 19.621 |
| 1795.0 | 19.788 |
| 1796.0 | 19.953 |
| 1797.0 | 20.106 |
| 1798.0 | 20.275 |
| 1799.0 | 20.434 |
| 1800.0 | 20.598 |
| 1801.0 | 20.767 |
| 1802.0 | 20.939 |
| 1803.0 | 21.104 |
| 1804.0 | 21.26 |
| 1805.0 | 21.423 |
| 1806.0 | 21.583 |
| 1807.0 | 21.75 |
| 1808.0 | 21.913 |
| 1809.0 | 22.068 |
| 1810.0 | 22.226 |
| 1811.0 | 22.391 |
| 1812.0 | 22.566 |
| 1813.0 | 22.724 |
| 1814.0 | 22.891 |
| 1815.0 | 23.054 |
| 1816.0 | 23.21 |
| 1817.0 | 23.376 |
| 1818.0 | 23.514 |
| 1819.0 | 23.674 |
| 1820.0 | 23.83 |
| 1821.0 | 24.007 |
| 1822.0 | 24.155 |
| 1823.0 | 24.307 |
| 1824.0 | 24.441 |
| 1825.0 | 24.576 |
| 1826.0 | 24.725 |
| 1827.0 | 24.882 |
| 1828.0 | 25.041 |
| 1829.0 | 25.178 |
| 1830.0 | 25.336 |
| 1831.0 | 25.485 |
| 1832.0 | 25.637 |
| 1833.0 | 25.777 |
| 1834.0 | 25.903 |
| 1835.0 | 26.029 |
| 1836.0 | 26.158 |
| 1837.0 | 26.291 |
| 1838.0 | 26.418 |
| 1839.0 | 26.552 |
| 1840.0 | 26.69 |
| 1841.0 | 26.833 |
| 1842.0 | 26.968 |
| 1843.0 | 27.096 |
| 1844.0 | 27.198 |
| 1845.0 | 27.292 |
| 1846.0 | 27.401 |
| 1847.0 | 27.531 |
| 1848.0 | 27.664 |
| 1849.0 | 27.773 |
| 1850.0 | 27.88 |
| 1851.0 | 27.977 |
| 1852.0 | 28.094 |
| 1853.0 | 28.197 |
| 1854.0 | 28.3 |
| 1855.0 | 28.397 |
| 1856.0 | 28.497 |
| 1857.0 | 28.587 |
| 1858.0 | 28.675 |
| 1859.0 | 28.761 |
| 1860.0 | 28.844 |
| 1861.0 | 28.929 |
| 1862.0 | 29.007 |
| 1863.0 | 29.084 |
| 1864.0 | 29.166 |
| 1865.0 | 29.249 |
| 1866.0 | 29.325 |
| 1867.0 | 29.402 |
| 1868.0 | 29.481 |
| 1869.0 | 29.544 |
| 1870.0 | 29.604 |
| 1871.0 | 29.66 |
| 1872.0 | 29.744 |
| 1873.0 | 29.816 |
| 1874.0 | 29.885 |
| 1875.0 | 29.932 |
| 1876.0 | 29.985 |
| 1877.0 | 30.042 |
| 1878.0 | 30.115 |
| 1879.0 | 30.183 |
| 1880.0 | 30.246 |
| 1881.0 | 30.296 |
| 1882.0 | 30.336 |
| 1883.0 | 30.379 |
| 1884.0 | 30.436 |
| 1885.0 | 30.505 |
| 1886.0 | 30.57 |
| 1887.0 | 30.619 |
| 1888.0 | 30.653 |
| 1889.0 | 30.684 |
| 1890.0 | 30.722 |
| 1891.0 | 30.768 |
| 1892.0 | 30.81 |
| 1893.0 | 30.855 |
| 1894.0 | 30.901 |
| 1895.0 | 30.944 |
| 1896.0 | 30.98 |
| 1897.0 | 31.025 |
| 1898.0 | 31.057 |
| 1899.0 | 31.088 |
| 1900.0 | 31.11 |
| 1901.0 | 31.141 |
| 1902.0 | 31.18 |
| 1903.0 | 31.219 |
| 1904.0 | 31.263 |
| 1905.0 | 31.305 |
| 1906.0 | 31.365 |
| 1907.0 | 31.425 |
| 1908.0 | 31.474 |
| 1909.0 | 31.524 |
| 1910.0 | 31.569 |
| 1911.0 | 31.621 |
| 1912.0 | 31.682 |
| 1913.0 | 31.745 |
| 1914.0 | 31.807 |
| 1915.0 | 31.861 |
| 1916.0 | 31.916 |
| 1917.0 | 31.962 |
| 1918.0 | 32.025 |
| 1919.0 | 32.101 |
| 1920.0 | 32.176 |
| 1921.0 | 32.243 |
| 1922.0 | 32.293 |
| 1923.0 | 32.339 |
| 1924.0 | 32.393 |
| 1925.0 | 32.457 |
| 1926.0 | 32.52 |
| 1927.0 | 32.57 |
| 1928.0 | 32.628 |
| 1929.0 | 32.69 |
| 1930.0 | 32.778 |
| 1931.0 | 32.868 |
| 1932.0 | 32.955 |
| 1933.0 | 33.021 |
| 1934.0 | 33.088 |
| 1935.0 | 33.174 |
| 1936.0 | 33.268 |
| 1937.0 | 33.349 |
| 1938.0 | 33.423 |
| 1939.0 | 33.495 |
| 1940.0 | 33.578 |
| 1941.0 | 33.672 |
| 1942.0 | 33.758 |
| 1943.0 | 33.835 |
| 1944.0 | 33.917 |
| 1945.0 | 34.005 |
| 1946.0 | 34.11 |
| 1947.0 | 34.21 |
| 1948.0 | 34.307 |
| 1949.0 | 34.396 |
| 1950.0 | 34.489 |
| 1951.0 | 34.595 |
| 1952.0 | 34.697 |
| 1953.0 | 34.787 |
| 1954.0 | 34.879 |
| 1955.0 | 34.986 |
| 1956.0 | 35.093 |
| 1957.0 | 35.193 |
| 1958.0 | 35.283 |
| 1959.0 | 35.387 |
| 1960.0 | 35.494 |
| 1961.0 | 35.607 |
| 1962.0 | 35.719 |
| 1963.0 | 35.805 |
| 1964.0 | 35.92 |
| 1965.0 | 36.032 |
| 1966.0 | 36.144 |
| 1967.0 | 36.24 |
| 1968.0 | 36.351 |
| 1969.0 | 36.473 |
| 1970.0 | 36.587 |
| 1971.0 | 36.693 |
| 1972.0 | 36.8 |
| 1973.0 | 36.916 |
| 1974.0 | 37.044 |
| 1975.0 | 37.163 |
| 1976.0 | 37.263 |
| 1977.0 | 37.379 |
| 1978.0 | 37.501 |
| 1979.0 | 37.623 |
| 1980.0 | 37.728 |
| 1981.0 | 37.847 |
| 1982.0 | 37.97 |
| 1983.0 | 38.09 |
| 1984.0 | 38.201 |
| 1985.0 | 38.307 |
| 1986.0 | 38.424 |
| 1987.0 | 38.555 |
| 1988.0 | 38.666 |
| 1989.0 | 38.767 |
| 1990.0 | 38.88 |
| 1991.0 | 38.998 |
| 1992.0 | 39.111 |
| 1993.0 | 39.208 |
| 1994.0 | 39.32 |
| 1995.0 | 39.437 |
| 1996.0 | 39.552 |
| 1997.0 | 39.648 |
| 1998.0 | 39.753 |
| 1999.0 | 39.864 |
| 2000.0 | 39.955 |
| 2001.0 | 40.049 |
| 2002.0 | 40.15 |
| 2003.0 | 40.252 |
| 2004.0 | 40.354 |
| 2005.0 | 40.443 |
| 2006.0 | 40.54 |
| 2007.0 | 40.641 |
| 2008.0 | 40.733 |
| 2009.0 | 40.826 |
| 2010.0 | 40.912 |
| 2011.0 | 41.009 |
| 2012.0 | 41.092 |
| 2013.0 | 41.182 |
| 2014.0 | 41.271 |
| 2015.0 | 41.358 |
| 2016.0 | 41.444 |
| 2017.0 | 41.521 |
| 2018.0 | 41.606 |
| 2019.0 | 41.688 |
| 2020.0 | 41.773 |
| 2021.0 | 41.836 |
| 2022.0 | 41.917 |
| 2023.0 | 41.99 |
| 2024.0 | 42.06 |
| 2025.0 | 42.119 |
| 2026.0 | 42.189 |
| 2027.0 | 42.258 |
| 2028.0 | 42.312 |
| 2029.0 | 42.372 |
| 2030.0 | 42.427 |
| 2031.0 | 42.489 |
| 2032.0 | 42.539 |
| 2033.0 | 42.591 |
| 2034.0 | 42.634 |
| 2035.0 | 42.678 |
| 2036.0 | 42.726 |
| 2037.0 | 42.767 |
| 2038.0 | 42.809 |
| 2039.0 | 42.846 |
| 2040.0 | 42.883 |
| 2041.0 | 42.92 |
| 2042.0 | 42.96 |
| 2043.0 | 42.989 |
| 2044.0 | 43.024 |
| 2045.0 | 43.058 |
| 2046.0 | 43.095 |
| 2047.0 | 43.116 |
| 2048.0 | 43.15 |
| 2049.0 | 43.18 |
| 2050.0 | 43.197 |
| 2051.0 | 43.225 |
| 2052.0 | 43.249 |
| 2053.0 | 43.268 |
| 2054.0 | 43.291 |
| 2055.0 | 43.307 |
| 2056.0 | 43.33 |
| 2057.0 | 43.344 |
| 2058.0 | 43.36 |
| 2059.0 | 43.373 |
| 2060.0 | 43.386 |
| 2061.0 | 43.391 |
| 2062.0 | 43.405 |
| 2063.0 | 43.414 |
| 2064.0 | 43.412 |
| 2065.0 | 43.42 |
| 2066.0 | 43.426 |
| 2067.0 | 43.423 |
| 2068.0 | 43.432 |
| 2069.0 | 43.429 |
| 2070.0 | 43.431 |
| 2071.0 | 43.429 |
| 2072.0 | 43.429 |
| 2073.0 | 43.434 |
| 2074.0 | 43.433 |
| 2075.0 | 43.428 |
| 2076.0 | 43.433 |
| 2077.0 | 43.431 |
| 2078.0 | 43.433 |
| 2079.0 | 43.438 |
| 2080.0 | 43.442 |
| 2081.0 | 43.438 |
| 2082.0 | 43.452 |
| 2083.0 | 43.459 |
| 2084.0 | 43.47 |
| 2085.0 | 43.483 |
| 2086.0 | 43.49 |
| 2087.0 | 43.512 |
| 2088.0 | 43.521 |
| 2089.0 | 43.543 |
| 2090.0 | 43.562 |
| 2091.0 | 43.58 |
| 2092.0 | 43.602 |
| 2093.0 | 43.625 |
| 2094.0 | 43.649 |
| 2095.0 | 43.673 |
| 2096.0 | 43.701 |
| 2097.0 | 43.729 |
| 2098.0 | 43.75 |
| 2099.0 | 43.779 |
| 2100.0 | 43.805 |
| 2101.0 | 43.835 |
| 2102.0 | 43.865 |
| 2103.0 | 43.891 |
| 2104.0 | 43.912 |
| 2105.0 | 43.939 |
| 2106.0 | 43.967 |
| 2107.0 | 43.99 |
| 2108.0 | 44.016 |
| 2109.0 | 44.036 |
| 2110.0 | 44.057 |
| 2111.0 | 44.084 |
| 2112.0 | 44.111 |
| 2113.0 | 44.127 |
| 2114.0 | 44.145 |
| 2115.0 | 44.169 |
| 2116.0 | 44.181 |
| 2117.0 | 44.196 |
| 2118.0 | 44.212 |
| 2119.0 | 44.22 |
| 2120.0 | 44.226 |
| 2121.0 | 44.243 |
| 2122.0 | 44.252 |
| 2123.0 | 44.254 |
| 2124.0 | 44.248 |
| 2125.0 | 44.23 |
| 2126.0 | 44.197 |
| 2127.0 | 44.14 |
| 2128.0 | 44.055 |
| 2129.0 | 43.944 |
| 2130.0 | 43.821 |
| 2131.0 | 43.703 |
| 2132.0 | 43.578 |
| 2133.0 | 43.482 |
| 2134.0 | 43.405 |
| 2135.0 | 43.377 |
| 2136.0 | 43.394 |
| 2137.0 | 43.463 |
| 2138.0 | 43.57 |
| 2139.0 | 43.704 |
| 2140.0 | 43.856 |
| 2141.0 | 44.032 |
| 2142.0 | 44.211 |
| 2143.0 | 44.366 |
| 2144.0 | 44.521 |
| 2145.0 | 44.651 |
| 2146.0 | 44.764 |
| 2147.0 | 44.863 |
| 2148.0 | 44.922 |
| 2149.0 | 44.957 |
| 2150.0 | 44.966 |
| 2151.0 | 44.95 |
| 2152.0 | 44.907 |
| 2153.0 | 44.834 |
| 2154.0 | 44.738 |
| 2155.0 | 44.611 |
| 2156.0 | 44.473 |
| 2157.0 | 44.332 |
| 2158.0 | 44.184 |
| 2159.0 | 44.043 |
| 2160.0 | 43.927 |
| 2161.0 | 43.847 |
| 2162.0 | 43.812 |
| 2163.0 | 43.842 |
| 2164.0 | 43.931 |
| 2165.0 | 44.089 |
| 2166.0 | 44.286 |
| 2167.0 | 44.555 |
| 2168.0 | 44.852 |
| 2169.0 | 45.142 |
| 2170.0 | 45.436 |
| 2171.0 | 45.71 |
| 2172.0 | 45.949 |
| 2173.0 | 46.159 |
| 2174.0 | 46.34 |
| 2175.0 | 46.483 |
| 2176.0 | 46.602 |
| 2177.0 | 46.698 |
| 2178.0 | 46.774 |
| 2179.0 | 46.83 |
| 2180.0 | 46.855 |
| 2181.0 | 46.886 |
| 2182.0 | 46.891 |
| 2183.0 | 46.889 |
| 2184.0 | 46.903 |
| 2185.0 | 46.872 |
| 2186.0 | 46.876 |
| 2187.0 | 46.871 |
| 2188.0 | 46.882 |
| 2189.0 | 46.925 |
| 2190.0 | 46.958 |
| 2191.0 | 47.005 |
| 2192.0 | 47.074 |
| 2193.0 | 47.142 |
| 2194.0 | 47.218 |
| 2195.0 | 47.312 |
| 2196.0 | 47.35 |
| 2197.0 | 47.431 |
| 2198.0 | 47.478 |
| 2199.0 | 47.533 |
| 2200.0 | 47.596 |
| 2201.0 | 47.609 |
| 2202.0 | 47.658 |
| 2203.0 | 47.681 |
| 2204.0 | 47.709 |
| 2205.0 | 47.759 |
| 2206.0 | 47.783 |
| 2207.0 | 47.813 |
| 2208.0 | 47.847 |
| 2209.0 | 47.881 |
| 2210.0 | 47.924 |
| 2211.0 | 47.972 |
| 2212.0 | 48.009 |
| 2213.0 | 48.063 |
| 2214.0 | 48.1 |
| 2215.0 | 48.152 |
| 2216.0 | 48.202 |
| 2217.0 | 48.24 |
| 2218.0 | 48.28 |
| 2219.0 | 48.301 |
| 2220.0 | 48.33 |
| 2221.0 | 48.346 |
| 2222.0 | 48.347 |
| 2223.0 | 48.346 |
| 2224.0 | 48.324 |
| 2225.0 | 48.297 |
| 2226.0 | 48.266 |
| 2227.0 | 48.225 |
| 2228.0 | 48.188 |
| 2229.0 | 48.138 |
| 2230.0 | 48.093 |
| 2231.0 | 48.05 |
| 2232.0 | 48.007 |
| 2233.0 | 47.973 |
| 2234.0 | 47.936 |
| 2235.0 | 47.896 |
| 2236.0 | 47.852 |
| 2237.0 | 47.81 |
| 2238.0 | 47.753 |
| 2239.0 | 47.684 |
| 2240.0 | 47.605 |
| 2241.0 | 47.507 |
| 2242.0 | 47.401 |
| 2243.0 | 47.275 |
| 2244.0 | 47.136 |
| 2245.0 | 46.963 |
| 2246.0 | 46.788 |
| 2247.0 | 46.592 |
| 2248.0 | 46.366 |
| 2249.0 | 46.143 |
| 2250.0 | 45.887 |
| 2251.0 | 45.618 |
| 2252.0 | 45.325 |
| 2253.0 | 45.036 |
| 2254.0 | 44.732 |
| 2255.0 | 44.4 |
| 2256.0 | 44.094 |
| 2257.0 | 43.746 |
| 2258.0 | 43.401 |
| 2259.0 | 43.06 |
| 2260.0 | 42.705 |
| 2261.0 | 42.363 |
| 2262.0 | 41.987 |
| 2263.0 | 41.632 |
| 2264.0 | 41.237 |
| 2265.0 | 40.848 |
| 2266.0 | 40.482 |
| 2267.0 | 40.09 |
| 2268.0 | 39.728 |
| 2269.0 | 39.352 |
| 2270.0 | 39.01 |
| 2271.0 | 38.691 |
| 2272.0 | 38.402 |
| 2273.0 | 38.176 |
| 2274.0 | 37.958 |
| 2275.0 | 37.793 |
| 2276.0 | 37.637 |
| 2277.0 | 37.492 |
| 2278.0 | 37.363 |
| 2279.0 | 37.216 |
| 2280.0 | 37.068 |
| 2281.0 | 36.899 |
| 2282.0 | 36.712 |
| 2283.0 | 36.514 |
| 2284.0 | 36.291 |
| 2285.0 | 36.078 |
| 2286.0 | 35.844 |
| 2287.0 | 35.622 |
| 2288.0 | 35.395 |
| 2289.0 | 35.174 |
| 2290.0 | 34.95 |
| 2291.0 | 34.746 |
| 2292.0 | 34.538 |
| 2293.0 | 34.331 |
| 2294.0 | 34.128 |
| 2295.0 | 33.936 |
| 2296.0 | 33.754 |
| 2297.0 | 33.565 |
| 2298.0 | 33.416 |
| 2299.0 | 33.23 |
| 2300.0 | 33.113 |
| 2301.0 | 32.983 |
| 2302.0 | 32.881 |
| 2303.0 | 32.815 |
| 2304.0 | 32.702 |
| 2305.0 | 32.657 |
| 2306.0 | 32.549 |
| 2307.0 | 32.476 |
| 2308.0 | 32.416 |
| 2309.0 | 32.291 |
| 2310.0 | 32.22 |
| 2311.0 | 32.095 |
| 2312.0 | 31.998 |
| 2313.0 | 31.969 |
| 2314.0 | 31.917 |
| 2315.0 | 31.981 |
| 2316.0 | 32.038 |
| 2317.0 | 32.126 |
| 2318.0 | 32.329 |
| 2319.0 | 32.506 |
| 2320.0 | 32.794 |
| 2321.0 | 33.067 |
| 2322.0 | 33.297 |
| 2323.0 | 33.553 |
| 2324.0 | 33.716 |
| 2325.0 | 33.925 |
| 2326.0 | 34.141 |
| 2327.0 | 34.269 |
| 2328.0 | 34.454 |
| 2329.0 | 34.518 |
| 2330.0 | 34.622 |
| 2331.0 | 34.745 |
| 2332.0 | 34.841 |
| 2333.0 | 34.976 |
| 2334.0 | 35.041 |
| 2335.0 | 35.071 |
| 2336.0 | 35.103 |
| 2337.0 | 35.126 |
| 2338.0 | 35.175 |
| 2339.0 | 35.229 |
| 2340.0 | 35.18 |
| 2341.0 | 35.179 |
| 2342.0 | 35.061 |
| 2343.0 | 35.034 |
| 2344.0 | 35.017 |
| 2345.0 | 34.957 |
| 2346.0 | 34.943 |
| 2347.0 | 34.814 |
| 2348.0 | 34.729 |
| 2349.0 | 34.655 |
| 2350.0 | 34.643 |
| 2351.0 | 34.639 |
| 2352.0 | 34.656 |
| 2353.0 | 34.59 |
| 2354.0 | 34.592 |
| 2355.0 | 34.551 |
| 2356.0 | 34.574 |
| 2357.0 | 34.626 |
| 2358.0 | 34.579 |
| 2359.0 | 34.578 |
| 2360.0 | 34.45 |
| 2361.0 | 34.402 |
| 2362.0 | 34.365 |
| 2363.0 | 34.358 |
| 2364.0 | 34.351 |
| 2365.0 | 34.337 |
| 2366.0 | 34.253 |
| 2367.0 | 34.25 |
| 2368.0 | 34.247 |
| 2369.0 | 34.282 |
| 2370.0 | 34.367 |
| 2371.0 | 34.318 |
| 2372.0 | 34.342 |
| 2373.0 | 34.294 |
| 2374.0 | 34.305 |
| 2375.0 | 34.357 |
| 2376.0 | 34.405 |
| 2377.0 | 34.388 |
| 2378.0 | 34.393 |
| 2379.0 | 34.288 |
| 2380.0 | 34.273 |
| 2381.0 | 34.256 |
| 2382.0 | 34.221 |
| 2383.0 | 34.232 |
| 2384.0 | 34.12 |
| 2385.0 | 34.03 |
| 2386.0 | 33.966 |
| 2387.0 | 33.881 |
| 2388.0 | 33.877 |
| 2389.0 | 33.873 |
| 2390.0 | 33.763 |
| 2391.0 | 33.731 |
| 2392.0 | 33.618 |
| 2393.0 | 33.554 |
| 2394.0 | 33.568 |
| 2395.0 | 33.514 |
| 2396.0 | 33.481 |
| 2397.0 | 33.427 |
| 2398.0 | 33.299 |
| 2399.0 | 33.276 |
| 2400.0 | 33.257 |
| 2401.0 | 33.255 |
| 2402.0 | 33.336 |
| 2403.0 | 33.319 |
| 2404.0 | 33.337 |
| 2405.0 | 33.423 |
| 2406.0 | 33.476 |
| 2407.0 | 33.645 |
| 2408.0 | 33.807 |
| 2409.0 | 33.887 |
| 2410.0 | 34.027 |
| 2411.0 | 34.097 |
| 2412.0 | 34.157 |
| 2413.0 | 34.335 |
| 2414.0 | 34.407 |
| 2415.0 | 34.502 |
| 2416.0 | 34.599 |
| 2417.0 | 34.569 |
| 2418.0 | 34.621 |
| 2419.0 | 34.691 |
| 2420.0 | 34.694 |
| 2421.0 | 34.805 |
| 2422.0 | 34.818 |
| 2423.0 | 34.77 |
| 2424.0 | 34.799 |
| 2425.0 | 34.747 |
| 2426.0 | 34.741 |
| 2427.0 | 34.797 |
| 2428.0 | 34.743 |
| 2429.0 | 34.714 |
| 2430.0 | 34.684 |
| 2431.0 | 34.558 |
| 2432.0 | 34.545 |
| 2433.0 | 34.507 |
| 2434.0 | 34.42 |
| 2435.0 | 34.397 |
| 2436.0 | 34.27 |
| 2437.0 | 34.107 |
| 2438.0 | 34.02 |
| 2439.0 | 33.854 |
| 2440.0 | 33.707 |
| 2441.0 | 33.592 |
| 2442.0 | 33.334 |
| 2443.0 | 33.115 |
| 2444.0 | 32.877 |
| 2445.0 | 32.578 |
| 2446.0 | 32.362 |
| 2447.0 | 32.143 |
| 2448.0 | 31.86 |
| 2449.0 | 31.661 |
| 2450.0 | 31.389 |
| 2451.0 | 31.11 |
| 2452.0 | 30.906 |
| 2453.0 | 30.689 |
| 2454.0 | 30.453 |
| 2455.0 | 30.288 |
| 2456.0 | 30.022 |
| 2457.0 | 29.807 |
| 2458.0 | 29.631 |
| 2459.0 | 29.472 |
| 2460.0 | 29.381 |
| 2461.0 | 29.381 |
| 2462.0 | 29.345 |
| 2463.0 | 29.427 |
| 2464.0 | 29.529 |
| 2465.0 | 29.67 |
| 2466.0 | 29.892 |
| 2467.0 | 30.138 |
| 2468.0 | 30.344 |
| 2469.0 | 30.613 |
| 2470.0 | 30.822 |
| 2471.0 | 31.049 |
| 2472.0 | 31.285 |
| 2473.0 | 31.515 |
| 2474.0 | 31.716 |
| 2475.0 | 31.949 |
| 2476.0 | 32.104 |
| 2477.0 | 32.256 |
| 2478.0 | 32.415 |
| 2479.0 | 32.516 |
| 2480.0 | 32.618 |
| 2481.0 | 32.721 |
| 2482.0 | 32.759 |
| 2483.0 | 32.775 |
| 2484.0 | 32.794 |
| 2485.0 | 32.767 |
| 2486.0 | 32.783 |
| 2487.0 | 32.787 |
| 2488.0 | 32.79 |
| 2489.0 | 32.783 |
| 2490.0 | 32.796 |
| 2491.0 | 32.757 |
| 2492.0 | 32.78 |
| 2493.0 | 32.765 |
| 2494.0 | 32.781 |
| 2495.0 | 32.773 |
| 2496.0 | 32.786 |
| 2497.0 | 32.734 |
| 2498.0 | 32.74 |
| 2499.0 | 32.695 |
| 2500.0 | 32.681 |
| 2501.0 | 32.657 |
| 2502.0 | 32.658 |
| 2503.0 | 32.61 |
| 2504.0 | 32.605 |
| 2505.0 | 32.566 |
| 2506.0 | 32.551 |
| 2507.0 | 32.534 |
| 2508.0 | 32.546 |
| 2509.0 | 32.549 |
| 2510.0 | 32.579 |
| 2511.0 | 32.607 |
| 2512.0 | 32.654 |
| 2513.0 | 32.714 |
| 2514.0 | 32.784 |
| 2515.0 | 32.884 |
| 2516.0 | 32.99 |
| 2517.0 | 33.105 |
| 2518.0 | 33.228 |
| 2519.0 | 33.369 |
| 2520.0 | 33.506 |
| 2521.0 | 33.671 |
| 2522.0 | 33.835 |
| 2523.0 | 34.009 |
| 2524.0 | 34.165 |
| 2525.0 | 34.329 |
| 2526.0 | 34.467 |
| 2527.0 | 34.615 |
| 2528.0 | 34.767 |
| 2529.0 | 34.922 |
| 2530.0 | 35.069 |
| 2531.0 | 35.232 |
| 2532.0 | 35.398 |
| 2533.0 | 35.549 |
| 2534.0 | 35.696 |
| 2535.0 | 35.831 |
| 2536.0 | 35.953 |
| 2537.0 | 36.059 |
| 2538.0 | 36.137 |
| 2539.0 | 36.202 |
| 2540.0 | 36.272 |
| 2541.0 | 36.337 |
| 2542.0 | 36.392 |
| 2543.0 | 36.459 |
| 2544.0 | 36.522 |
| 2545.0 | 36.557 |
| 2546.0 | 36.622 |
| 2547.0 | 36.665 |
| 2548.0 | 36.675 |
| 2549.0 | 36.713 |
| 2550.0 | 36.729 |
| 2551.0 | 36.732 |
| 2552.0 | 36.757 |
| 2553.0 | 36.783 |
| 2554.0 | 36.799 |
| 2555.0 | 36.862 |
| 2556.0 | 36.912 |
| 2557.0 | 36.944 |
| 2558.0 | 37 |
| 2559.0 | 37.073 |
| 2560.0 | 37.116 |
| 2561.0 | 37.181 |
| 2562.0 | 37.243 |
| 2563.0 | 37.294 |
| 2564.0 | 37.359 |
| 2565.0 | 37.435 |
| 2566.0 | 37.476 |
| 2567.0 | 37.518 |
| 2568.0 | 37.589 |
| 2569.0 | 37.623 |
| 2570.0 | 37.667 |
| 2571.0 | 37.72 |
| 2572.0 | 37.731 |
| 2573.0 | 37.739 |
| 2574.0 | 37.756 |
| 2575.0 | 37.761 |
| 2576.0 | 37.748 |
| 2577.0 | 37.742 |
| 2578.0 | 37.727 |
| 2579.0 | 37.709 |
| 2580.0 | 37.72 |
| 2581.0 | 37.758 |
| 2582.0 | 37.828 |
| 2583.0 | 37.916 |
| 2584.0 | 38.024 |
| 2585.0 | 38.137 |
| 2586.0 | 38.268 |
| 2587.0 | 38.418 |
| 2588.0 | 38.575 |
| 2589.0 | 38.729 |
| 2590.0 | 38.868 |
| 2591.0 | 38.985 |
| 2592.0 | 39.096 |
| 2593.0 | 39.209 |
| 2594.0 | 39.304 |
| 2595.0 | 39.39 |
| 2596.0 | 39.46 |
| 2597.0 | 39.505 |
| 2598.0 | 39.547 |
| 2599.0 | 39.599 |